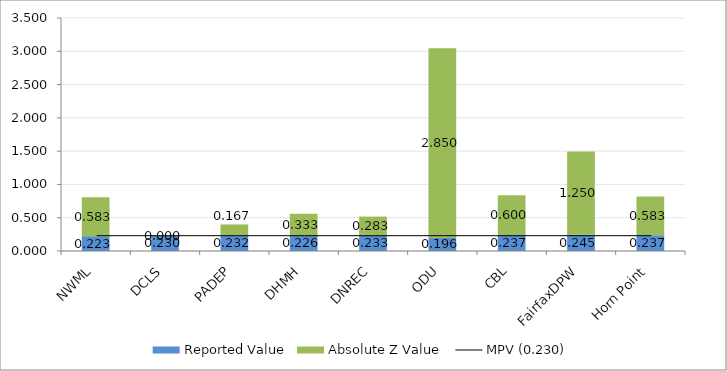
| Category | Reported Value | Absolute Z Value  |
|---|---|---|
| NWML | 0.223 | 0.583 |
| DCLS | 0.23 | 0 |
| PADEP | 0.232 | 0.167 |
| DHMH | 0.226 | 0.333 |
| DNREC | 0.233 | 0.283 |
| ODU | 0.196 | 2.85 |
| CBL | 0.237 | 0.6 |
| FairfaxDPW | 0.245 | 1.25 |
| Horn Point | 0.237 | 0.583 |